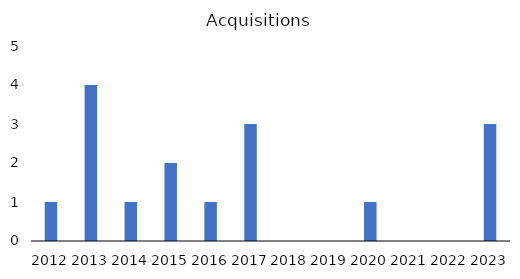
| Category | Series 0 |
|---|---|
| 2012.0 | 1 |
| 2013.0 | 4 |
| 2014.0 | 1 |
| 2015.0 | 2 |
| 2016.0 | 1 |
| 2017.0 | 3 |
| 2018.0 | 0 |
| 2019.0 | 0 |
| 2020.0 | 1 |
| 2021.0 | 0 |
| 2022.0 | 0 |
| 2023.0 | 3 |